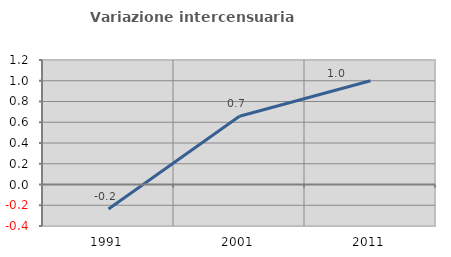
| Category | Variazione intercensuaria annua |
|---|---|
| 1991.0 | -0.237 |
| 2001.0 | 0.658 |
| 2011.0 | 1 |